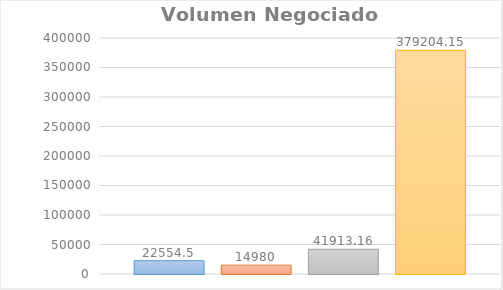
| Category | Lunes | Martes | Miercoles | Jueves | Viernes |
|---|---|---|---|---|---|
| 0 | 22554.5 | 14980 | 41913.16 | 379204.15 |  |